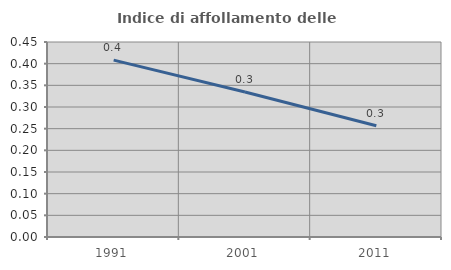
| Category | Indice di affollamento delle abitazioni  |
|---|---|
| 1991.0 | 0.408 |
| 2001.0 | 0.334 |
| 2011.0 | 0.257 |